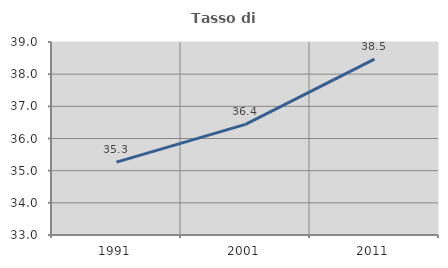
| Category | Tasso di occupazione   |
|---|---|
| 1991.0 | 35.267 |
| 2001.0 | 36.439 |
| 2011.0 | 38.466 |